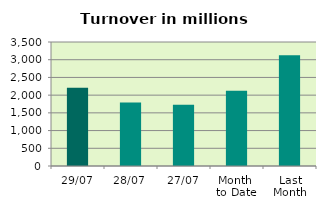
| Category | Series 0 |
|---|---|
| 29/07 | 2206.061 |
| 28/07 | 1794.79 |
| 27/07 | 1731.421 |
| Month 
to Date | 2122.755 |
| Last
Month | 3125.17 |